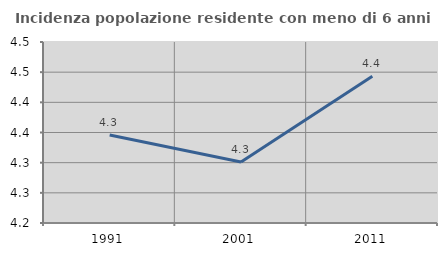
| Category | Incidenza popolazione residente con meno di 6 anni |
|---|---|
| 1991.0 | 4.346 |
| 2001.0 | 4.301 |
| 2011.0 | 4.443 |